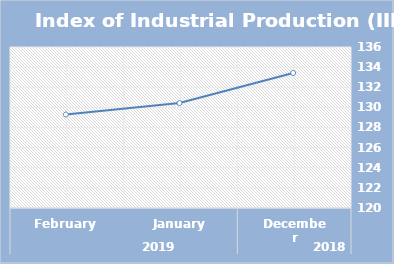
| Category | Index |
|---|---|
| 0 | 133.42 |
| 1 | 130.43 |
| 2 | 129.29 |